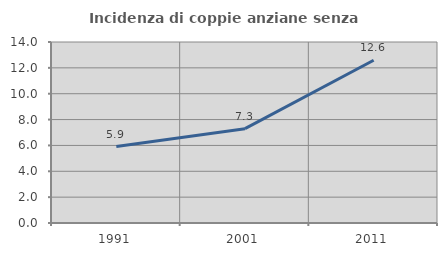
| Category | Incidenza di coppie anziane senza figli  |
|---|---|
| 1991.0 | 5.915 |
| 2001.0 | 7.295 |
| 2011.0 | 12.591 |